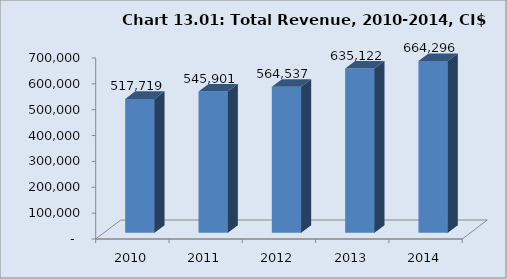
| Category | CI$ (000's) |
|---|---|
| 2010.0 | 517719 |
| 2011.0 | 545901 |
| 2012.0 | 564536.891 |
| 2013.0 | 635122.313 |
| 2014.0 | 664296 |